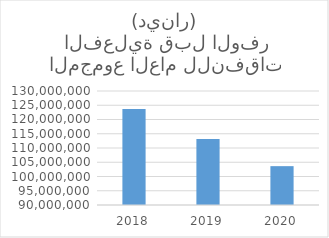
| Category | المجموع العام للنفقات الفعلية قبل الوفر (دينار) |
|---|---|
| 2018.0 | 123725079 |
| 2019.0 | 113148372 |
| 2020.0 | 103631875 |